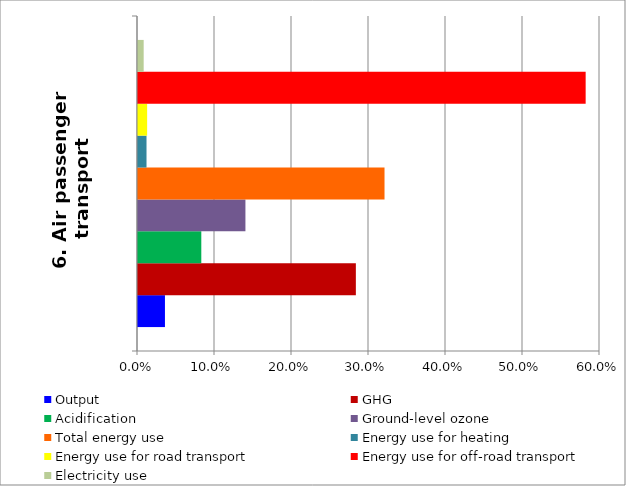
| Category | Output | GHG | Acidification | Ground-level ozone | Total energy use | Energy use for heating | Energy use for road transport | Energy use for off-road transport | Electricity use |
|---|---|---|---|---|---|---|---|---|---|
| 6. Air passenger transport   | 0.035 | 0.283 | 0.082 | 0.14 | 0.32 | 0.011 | 0.012 | 0.581 | 0.007 |